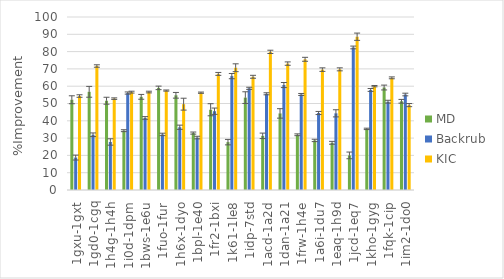
| Category | MD | Backrub | KIC |
|---|---|---|---|
| 1gxu-1gxt | 52.159 | 18.75 | 54.318 |
| 1gd0-1cgq | 56.754 | 31.93 | 71.667 |
| 1h4g-1h4h | 51.602 | 27.767 | 52.816 |
| 1i0d-1dpm | 34.286 | 56.049 | 56.565 |
| 1bws-1e6u | 53.854 | 41.656 | 56.624 |
| 1fuo-1fur | 59.027 | 32.124 | 57.478 |
| 1h6x-1dyo | 54.744 | 36.282 | 49.615 |
| 1bpl-1e40 | 32.897 | 30.31 | 56.241 |
| 1fr2-1bxi | 46.386 | 45.542 | 67.108 |
| 1k61-1le8 | 27.667 | 65.833 | 70.667 |
| 1idp-7std | 53.401 | 58.776 | 65.442 |
| 1acd-1a2d | 31.308 | 55.615 | 79.846 |
| 1dan-1a21 | 44.267 | 60.667 | 73.067 |
| 1frw-1h4e | 31.923 | 55.22 | 75.549 |
| 1a6i-1du7 | 28.653 | 44.508 | 69.585 |
| 1eaq-1h9d | 27.288 | 44.322 | 69.746 |
| 1jcd-1eq7 | 20 | 82.4 | 88.6 |
| 1kho-1gyg | 35.324 | 57.838 | 60.027 |
| 1fqk-1cip | 59.236 | 51.051 | 64.841 |
| 1im2-1do0 | 51.284 | 55.194 | 49.075 |